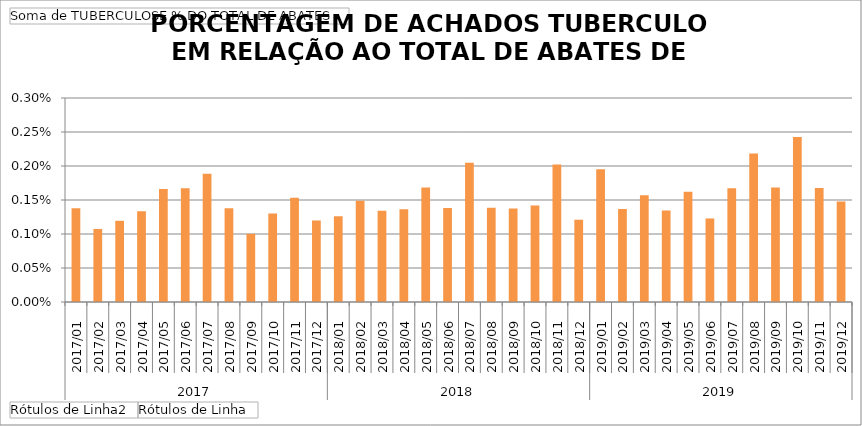
| Category | Total |
|---|---|
| 0 | 0.001 |
| 1 | 0.001 |
| 2 | 0.001 |
| 3 | 0.001 |
| 4 | 0.002 |
| 5 | 0.002 |
| 6 | 0.002 |
| 7 | 0.001 |
| 8 | 0.001 |
| 9 | 0.001 |
| 10 | 0.002 |
| 11 | 0.001 |
| 12 | 0.001 |
| 13 | 0.001 |
| 14 | 0.001 |
| 15 | 0.001 |
| 16 | 0.002 |
| 17 | 0.001 |
| 18 | 0.002 |
| 19 | 0.001 |
| 20 | 0.001 |
| 21 | 0.001 |
| 22 | 0.002 |
| 23 | 0.001 |
| 24 | 0.002 |
| 25 | 0.001 |
| 26 | 0.002 |
| 27 | 0.001 |
| 28 | 0.002 |
| 29 | 0.001 |
| 30 | 0.002 |
| 31 | 0.002 |
| 32 | 0.002 |
| 33 | 0.002 |
| 34 | 0.002 |
| 35 | 0.001 |